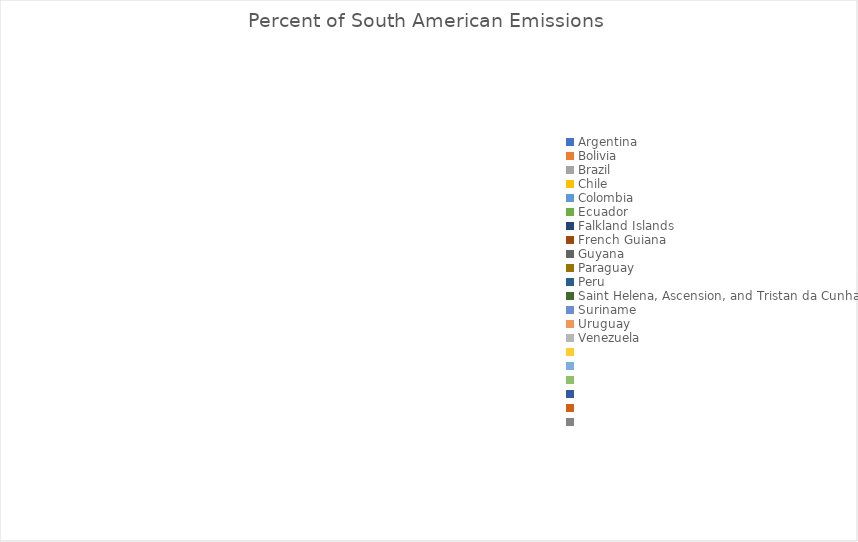
| Category | Percent of South American Emissions  |
|---|---|
| Argentina | 0 |
| Bolivia | 0 |
| Brazil | 0 |
| Chile | 0 |
| Colombia | 0 |
| Ecuador | 0 |
| Falkland Islands | 0 |
| French Guiana | 0 |
| Guyana | 0 |
| Paraguay | 0 |
| Peru | 0 |
| Saint Helena, Ascension, and Tristan da Cunha | 0 |
| Suriname | 0 |
| Uruguay | 0 |
| Venezuela | 0 |